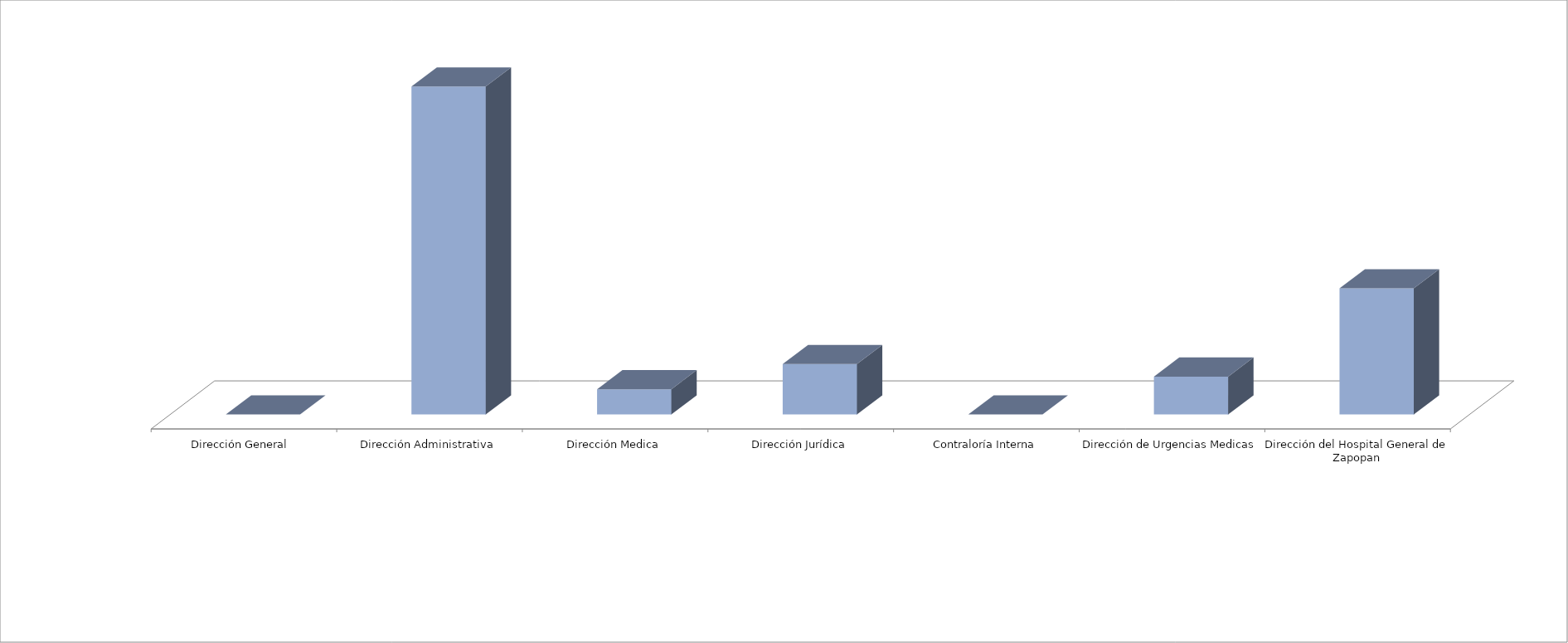
| Category | Series 0 | Series 1 |
|---|---|---|
| Dirección General  |  | 0 |
| Dirección Administrativa |  | 26 |
| Dirección Medica |  | 2 |
| Dirección Jurídica |  | 4 |
| Contraloría Interna |  | 0 |
| Dirección de Urgencias Medicas |  | 3 |
| Dirección del Hospital General de Zapopan |  | 10 |